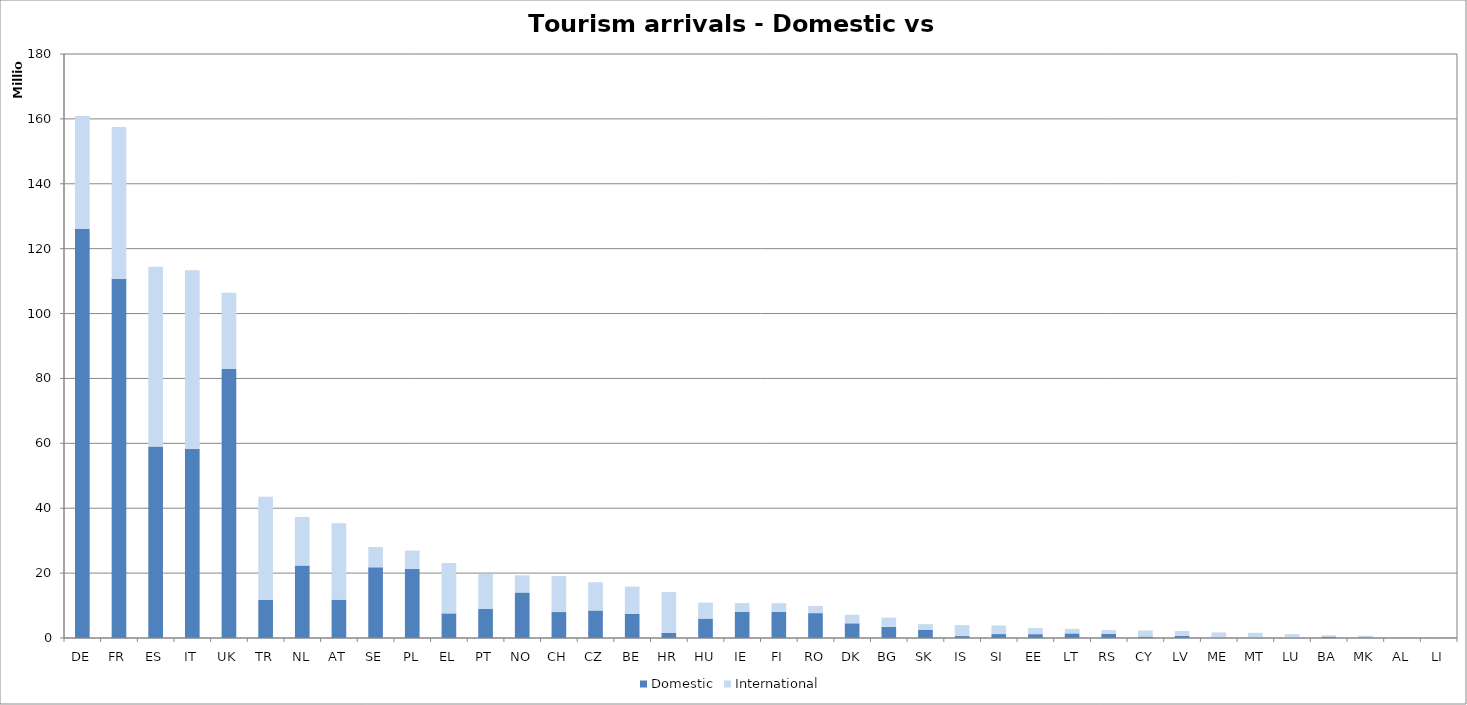
| Category | Domestic | International |
|---|---|---|
| DE | 126062735 | 34831012 |
| FR | 110695233 | 46797708 |
| ES | 59021796 | 55426615 |
| IT | 58320992 | 55033682 |
| UK | 82914000 | 23507227 |
| TR | 11731463 | 31782832 |
| NL | 22311303 | 15007135 |
| AT | 11805718 | 23544384 |
| SE | 21788707 | 6267866 |
| PL | 21252486 | 5689570 |
| EL | 7599373 | 15500471 |
| PT | 8940270 | 10839925 |
| NO | 14029604 | 5303531 |
| CH | 8000000 | 11090000 |
| CZ | 8488637 | 8706913 |
| BE | 7492173 | 8354753 |
| HR | 1613517 | 12543509 |
| HU | 5984739 | 4928511 |
| IE | 8088800 | 2666848 |
| FI | 8112802 | 2622039 |
| RO | 7664325 | 2234232 |
| DK | 4533666 | 2630938 |
| BG | 3414665 | 2864371 |
| SK | 2573289 | 1700746 |
| IS | 602016 | 3376068 |
| SI | 1209019 | 2669204 |
| EE | 1182979 | 1929164 |
| LT | 1417321 | 1388487 |
| RS | 1281983 | 1127284 |
| CY | 441552 | 1874323 |
| LV | 664628 | 1474765 |
| ME | 153185 | 1559924 |
| MT | 157267 | 1428801 |
| LU | 106541 | 1089576 |
| BA | 310227 | 536354 |
| MK | 219532 | 479152 |
| AL | 136000 | 161000 |
| LI | 983 | 56666 |